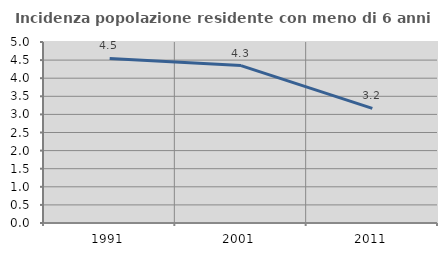
| Category | Incidenza popolazione residente con meno di 6 anni |
|---|---|
| 1991.0 | 4.545 |
| 2001.0 | 4.348 |
| 2011.0 | 3.167 |